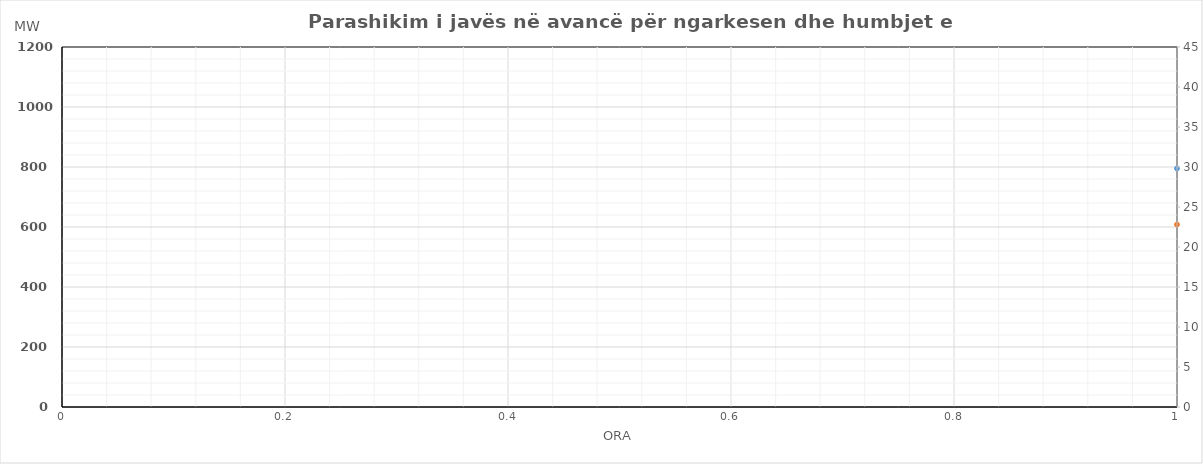
| Category | Ngarkesa (MWh) |
|---|---|
| 0 | 608.141 |
| 1 | 555.71 |
| 2 | 539.727 |
| 3 | 558.395 |
| 4 | 553.176 |
| 5 | 569.751 |
| 6 | 659.442 |
| 7 | 781.098 |
| 8 | 859.126 |
| 9 | 869.833 |
| 10 | 874.549 |
| 11 | 861.818 |
| 12 | 883.734 |
| 13 | 889.488 |
| 14 | 877.242 |
| 15 | 849.638 |
| 16 | 850.124 |
| 17 | 864.93 |
| 18 | 891.252 |
| 19 | 949.857 |
| 20 | 1010.064 |
| 21 | 958.43 |
| 22 | 840.973 |
| 23 | 721.65 |
| 24 | 644.263 |
| 25 | 587.841 |
| 26 | 568.135 |
| 27 | 579.987 |
| 28 | 570.357 |
| 29 | 568.236 |
| 30 | 658.287 |
| 31 | 768.445 |
| 32 | 861.049 |
| 33 | 915.085 |
| 34 | 918.377 |
| 35 | 898.805 |
| 36 | 897.179 |
| 37 | 865.366 |
| 38 | 817.335 |
| 39 | 796.589 |
| 40 | 810.66 |
| 41 | 835.806 |
| 42 | 865.551 |
| 43 | 916.345 |
| 44 | 958.633 |
| 45 | 906.282 |
| 46 | 812.224 |
| 47 | 709.25 |
| 48 | 620.695 |
| 49 | 559.317 |
| 50 | 541.971 |
| 51 | 561.846 |
| 52 | 559.461 |
| 53 | 573.964 |
| 54 | 689.477 |
| 55 | 859.345 |
| 56 | 884.129 |
| 57 | 874.347 |
| 58 | 827.161 |
| 59 | 803.377 |
| 60 | 812.673 |
| 61 | 798.227 |
| 62 | 787.509 |
| 63 | 791.871 |
| 64 | 807.787 |
| 65 | 859.045 |
| 66 | 929.711 |
| 67 | 978.181 |
| 68 | 1005.951 |
| 69 | 941.404 |
| 70 | 830.368 |
| 71 | 696.263 |
| 72 | 646.263 |
| 73 | 589.841 |
| 74 | 570.135 |
| 75 | 581.987 |
| 76 | 572.357 |
| 77 | 570.236 |
| 78 | 660.287 |
| 79 | 770.445 |
| 80 | 863.049 |
| 81 | 917.085 |
| 82 | 920.377 |
| 83 | 900.805 |
| 84 | 899.179 |
| 85 | 867.366 |
| 86 | 819.335 |
| 87 | 798.589 |
| 88 | 812.66 |
| 89 | 837.806 |
| 90 | 867.551 |
| 91 | 918.345 |
| 92 | 960.633 |
| 93 | 908.282 |
| 94 | 814.224 |
| 95 | 711.25 |
| 96 | 604.141 |
| 97 | 551.71 |
| 98 | 535.727 |
| 99 | 554.395 |
| 100 | 549.176 |
| 101 | 565.751 |
| 102 | 655.442 |
| 103 | 777.098 |
| 104 | 855.126 |
| 105 | 865.833 |
| 106 | 870.549 |
| 107 | 857.818 |
| 108 | 879.734 |
| 109 | 885.488 |
| 110 | 873.242 |
| 111 | 845.638 |
| 112 | 846.124 |
| 113 | 860.93 |
| 114 | 887.252 |
| 115 | 945.857 |
| 116 | 1006.064 |
| 117 | 954.43 |
| 118 | 836.973 |
| 119 | 717.65 |
| 120 | 623.695 |
| 121 | 562.317 |
| 122 | 544.971 |
| 123 | 564.846 |
| 124 | 562.461 |
| 125 | 576.964 |
| 126 | 692.477 |
| 127 | 862.345 |
| 128 | 887.129 |
| 129 | 877.347 |
| 130 | 830.161 |
| 131 | 806.377 |
| 132 | 815.673 |
| 133 | 801.227 |
| 134 | 790.509 |
| 135 | 794.871 |
| 136 | 810.787 |
| 137 | 862.045 |
| 138 | 932.711 |
| 139 | 981.181 |
| 140 | 1008.951 |
| 141 | 944.404 |
| 142 | 833.368 |
| 143 | 699.263 |
| 144 | 606.141 |
| 145 | 553.71 |
| 146 | 537.727 |
| 147 | 556.395 |
| 148 | 551.176 |
| 149 | 567.751 |
| 150 | 657.442 |
| 151 | 779.098 |
| 152 | 857.126 |
| 153 | 867.833 |
| 154 | 872.549 |
| 155 | 859.818 |
| 156 | 881.734 |
| 157 | 887.488 |
| 158 | 875.242 |
| 159 | 847.638 |
| 160 | 848.124 |
| 161 | 862.93 |
| 162 | 889.252 |
| 163 | 947.857 |
| 164 | 1008.064 |
| 165 | 956.43 |
| 166 | 838.973 |
| 167 | 719.65 |